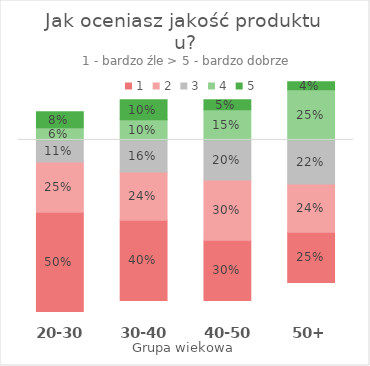
| Category |   | 1 | 2 | 3 | 4 | 5 |
|---|---|---|---|---|---|---|
| 20-30 | 0 | 0.5 | 0.25 | 0.11 | 0.06 | 0.08 |
| 30-40 | 0.06 | 0.4 | 0.24 | 0.16 | 0.1 | 0.1 |
| 40-50 | 0.06 | 0.3 | 0.3 | 0.2 | 0.15 | 0.05 |
| 50+ | 0.15 | 0.25 | 0.24 | 0.22 | 0.25 | 0.04 |